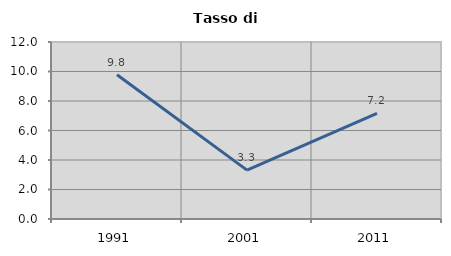
| Category | Tasso di disoccupazione   |
|---|---|
| 1991.0 | 9.78 |
| 2001.0 | 3.313 |
| 2011.0 | 7.169 |